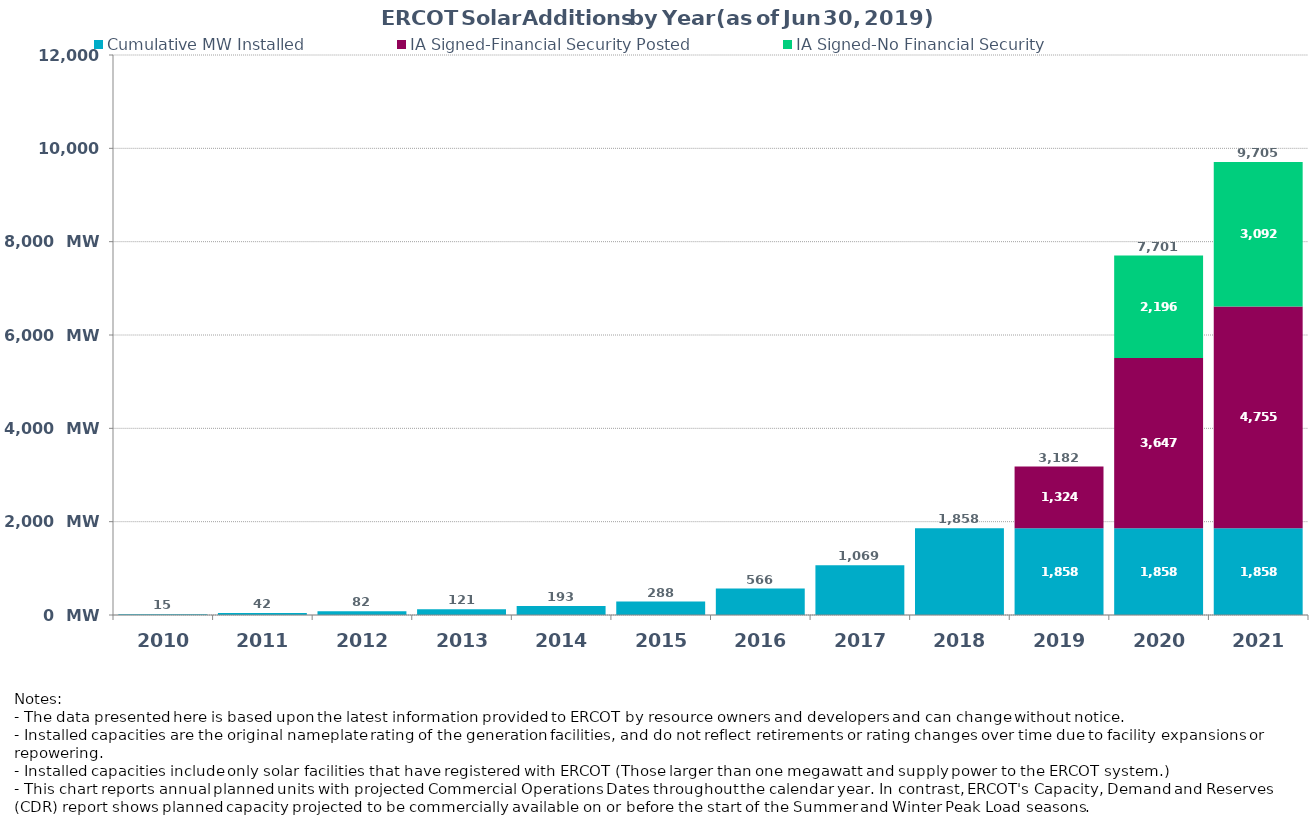
| Category | Cumulative MW Installed | IA Signed-Financial Security Posted  | IA Signed-No Financial Security  | Cumulative Installed and Planned |
|---|---|---|---|---|
| 2010.0 | 15 | 0 | 0 | 15 |
| 2011.0 | 42 | 0 | 0 | 42 |
| 2012.0 | 82 | 0 | 0 | 82 |
| 2013.0 | 121 | 0 | 0 | 121 |
| 2014.0 | 193 | 0 | 0 | 193 |
| 2015.0 | 287.7 | 0 | 0 | 287.7 |
| 2016.0 | 566.4 | 0 | 0 | 566.4 |
| 2017.0 | 1068.7 | 0 | 0 | 1068.7 |
| 2018.0 | 1857.7 | 0 | 0 | 1857.7 |
| 2019.0 | 1857.68 | 1324.4 | 0 | 3182.08 |
| 2020.0 | 1857.68 | 3647.43 | 2195.9 | 7701.01 |
| 2021.0 | 1857.68 | 4754.68 | 3092.4 | 9704.76 |